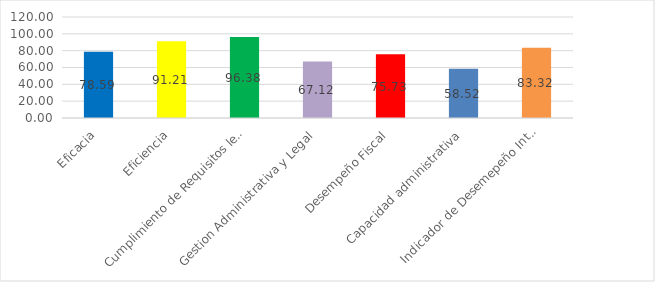
| Category | Series 0 |
|---|---|
| Eficacia | 78.59 |
| Eficiencia | 91.21 |
| Cumplimiento de Requisitos legales | 96.38 |
| Gestion Administrativa y Legal | 67.12 |
| Desempeño Fiscal | 75.73 |
| Capacidad administrativa | 58.52 |
| Indicador de Desemepeño Integral | 83.32 |